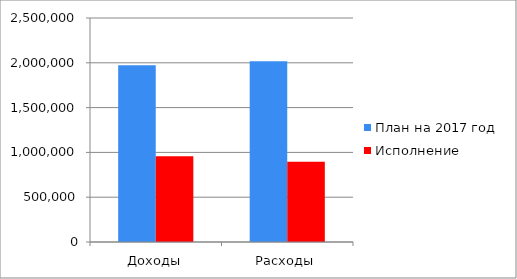
| Category | План на 2017 год | Исполнение |
|---|---|---|
| Доходы | 1971417.5 | 955937.2 |
| Расходы | 2017976.5 | 894729.2 |